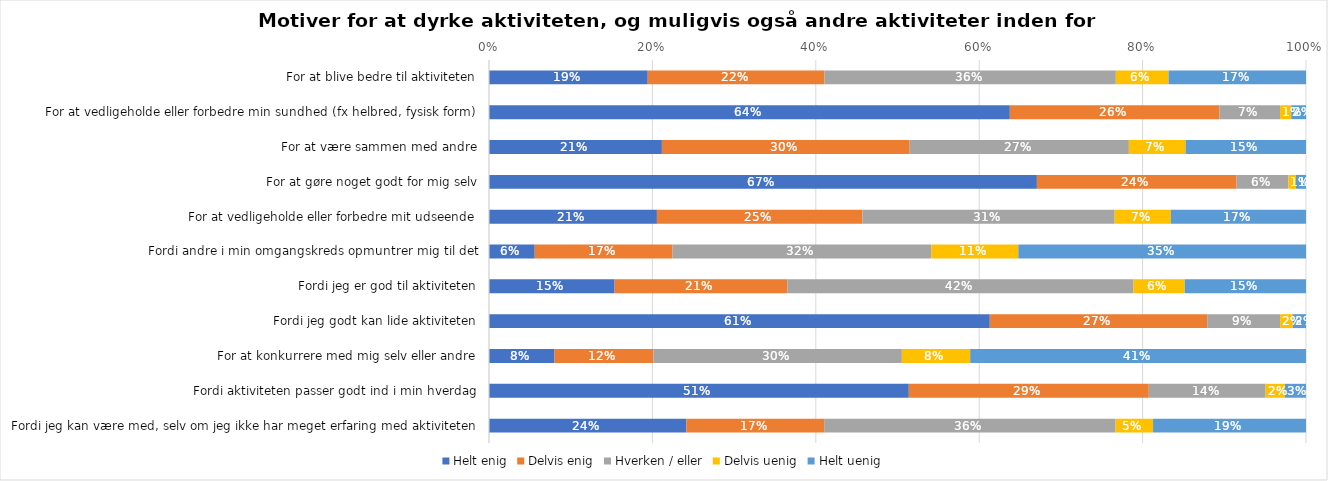
| Category | Helt enig | Delvis enig | Hverken / eller | Delvis uenig | Helt uenig |
|---|---|---|---|---|---|
| For at blive bedre til aktiviteten | 0.194 | 0.216 | 0.357 | 0.065 | 0.168 |
| For at vedligeholde eller forbedre min sundhed (fx helbred, fysisk form) | 0.637 | 0.257 | 0.074 | 0.014 | 0.018 |
| For at være sammen med andre | 0.212 | 0.303 | 0.268 | 0.069 | 0.147 |
| For at gøre noget godt for mig selv | 0.671 | 0.244 | 0.063 | 0.009 | 0.012 |
| For at vedligeholde eller forbedre mit udseende | 0.206 | 0.252 | 0.309 | 0.069 | 0.165 |
| Fordi andre i min omgangskreds opmuntrer mig til det | 0.056 | 0.169 | 0.317 | 0.107 | 0.352 |
| Fordi jeg er god til aktiviteten | 0.154 | 0.211 | 0.424 | 0.063 | 0.148 |
| Fordi jeg godt kan lide aktiviteten | 0.613 | 0.266 | 0.089 | 0.016 | 0.016 |
| For at konkurrere med mig selv eller andre | 0.08 | 0.121 | 0.304 | 0.084 | 0.411 |
| Fordi aktiviteten passer godt ind i min hverdag | 0.514 | 0.294 | 0.143 | 0.024 | 0.026 |
| Fordi jeg kan være med, selv om jeg ikke har meget erfaring med aktiviteten | 0.241 | 0.169 | 0.357 | 0.046 | 0.187 |